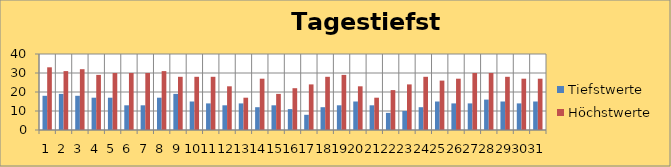
| Category | Tiefstwerte | Höchstwerte |
|---|---|---|
| 0 | 18 | 33 |
| 1 | 19 | 31 |
| 2 | 18 | 32 |
| 3 | 17 | 29 |
| 4 | 17 | 30 |
| 5 | 13 | 30 |
| 6 | 13 | 30 |
| 7 | 17 | 31 |
| 8 | 19 | 28 |
| 9 | 15 | 28 |
| 10 | 14 | 28 |
| 11 | 13 | 23 |
| 12 | 14 | 17 |
| 13 | 12 | 27 |
| 14 | 13 | 19 |
| 15 | 11 | 22 |
| 16 | 8 | 24 |
| 17 | 12 | 28 |
| 18 | 13 | 29 |
| 19 | 15 | 23 |
| 20 | 13 | 17 |
| 21 | 9 | 21 |
| 22 | 10 | 24 |
| 23 | 12 | 28 |
| 24 | 15 | 26 |
| 25 | 14 | 27 |
| 26 | 14 | 30 |
| 27 | 16 | 30 |
| 28 | 15 | 28 |
| 29 | 14 | 27 |
| 30 | 15 | 27 |